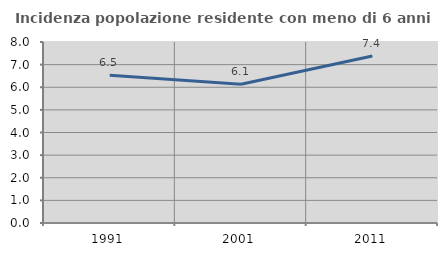
| Category | Incidenza popolazione residente con meno di 6 anni |
|---|---|
| 1991.0 | 6.534 |
| 2001.0 | 6.134 |
| 2011.0 | 7.38 |